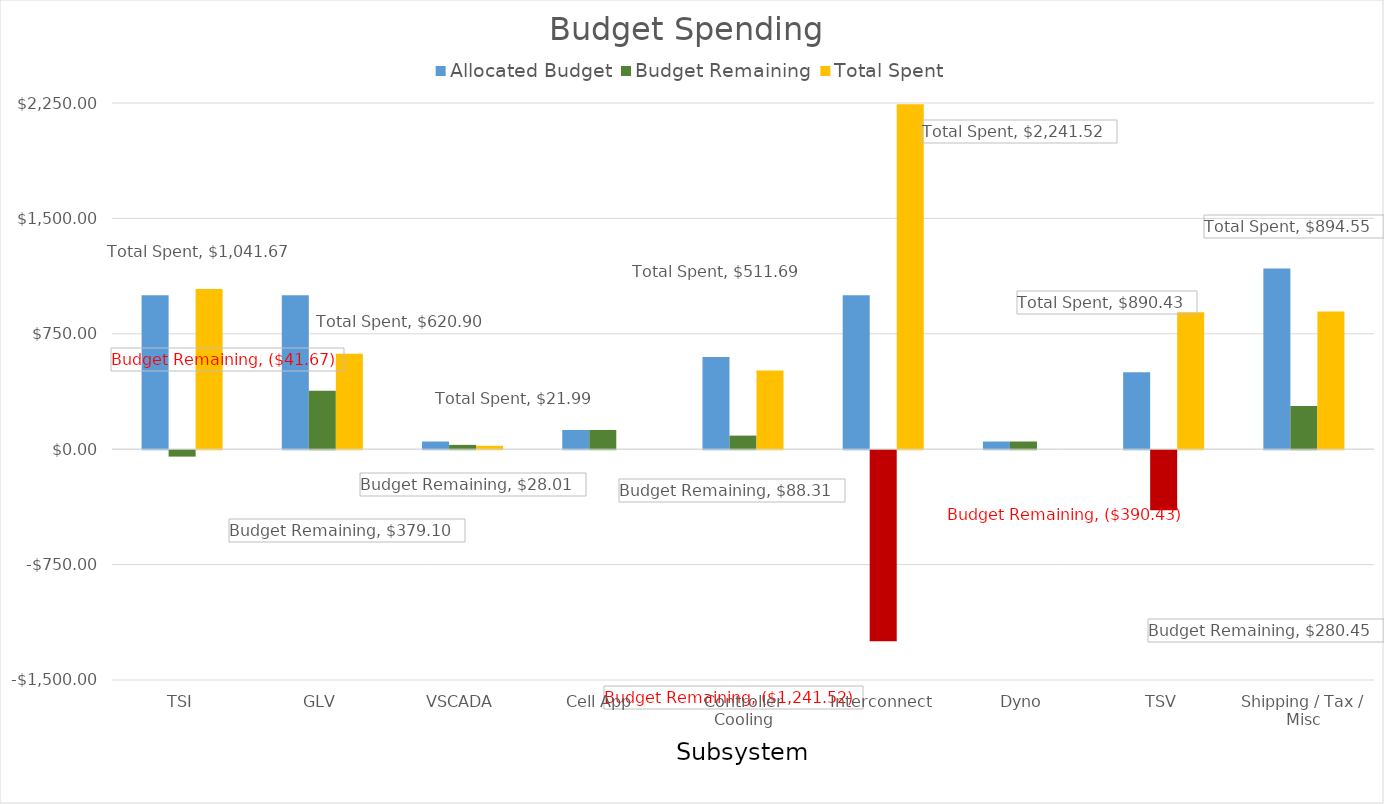
| Category | Allocated Budget | Budget Remaining | Total Spent |
|---|---|---|---|
| TSI | 1000 | -41.67 | 1041.67 |
| GLV | 1000 | 379.1 | 620.9 |
| VSCADA | 50 | 28.01 | 21.99 |
| Cell App | 125 | 125 | 0 |
| Controller Cooling | 600 | 88.31 | 511.69 |
| Interconnect | 1000 | -1241.52 | 2241.52 |
| Dyno | 50 | 50 | 0 |
| TSV | 500 | -390.43 | 890.43 |
| Shipping / Tax / Misc | 1175 | 280.45 | 894.55 |